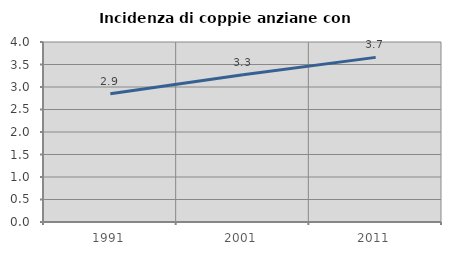
| Category | Incidenza di coppie anziane con figli |
|---|---|
| 1991.0 | 2.852 |
| 2001.0 | 3.271 |
| 2011.0 | 3.659 |